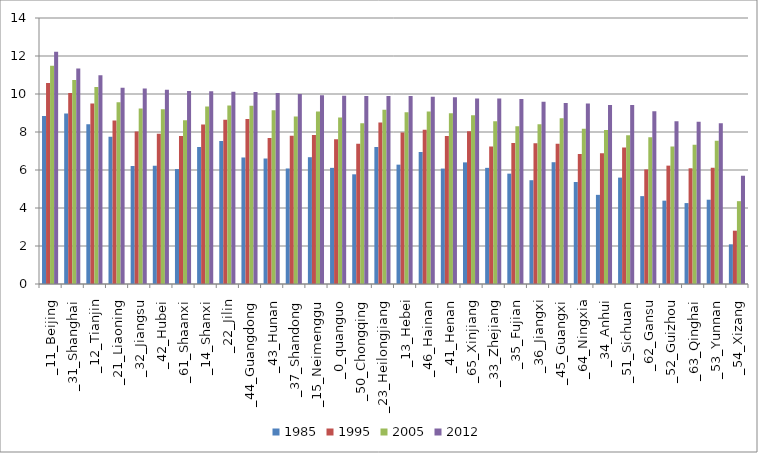
| Category | 1985 | 1995 | 2005 | 2012 |
|---|---|---|---|---|
| _11_Beijing | 8.841 | 10.581 | 11.493 | 12.227 |
| _31_Shanghai | 8.972 | 10.046 | 10.738 | 11.34 |
| _12_Tianjin | 8.406 | 9.5 | 10.371 | 10.991 |
| _21_Liaoning | 7.744 | 8.602 | 9.561 | 10.326 |
| _32_Jiangsu | 6.21 | 8.027 | 9.239 | 10.286 |
| _42_Hubei | 6.224 | 7.901 | 9.191 | 10.228 |
| _61_Shaanxi | 6.049 | 7.794 | 8.614 | 10.161 |
| _14_Shanxi | 7.213 | 8.389 | 9.337 | 10.143 |
| _22_Jilin | 7.521 | 8.638 | 9.397 | 10.119 |
| _44_Guangdong | 6.659 | 8.69 | 9.383 | 10.108 |
| _43_Hunan | 6.605 | 7.678 | 9.14 | 10.057 |
| _37_Shandong | 6.08 | 7.807 | 8.82 | 9.994 |
| _15_Neimenggu | 6.674 | 7.836 | 9.076 | 9.935 |
| _0_quanguo | 6.113 | 7.62 | 8.757 | 9.909 |
| _50_Chongqing | 5.773 | 7.388 | 8.456 | 9.899 |
| _23_Heilongjiang | 7.214 | 8.494 | 9.167 | 9.894 |
| _13_Hebei | 6.281 | 7.968 | 9.038 | 9.892 |
| _46_Hainan | 6.952 | 8.123 | 9.074 | 9.859 |
| _41_Henan | 6.075 | 7.789 | 8.992 | 9.832 |
| _65_Xinjiang | 6.401 | 8.036 | 8.881 | 9.763 |
| _33_Zhejiang | 6.113 | 7.236 | 8.563 | 9.763 |
| _35_Fujian | 5.808 | 7.417 | 8.298 | 9.735 |
| _36_Jiangxi | 5.463 | 7.41 | 8.408 | 9.596 |
| _45_Guangxi | 6.41 | 7.383 | 8.727 | 9.52 |
| _64_Ningxia | 5.368 | 6.843 | 8.166 | 9.499 |
| _34_Anhui | 4.692 | 6.883 | 8.101 | 9.42 |
| _51_Sichuan | 5.599 | 7.18 | 7.835 | 9.418 |
| _62_Gansu | 4.625 | 6.03 | 7.728 | 9.086 |
| _52_Guizhou | 4.386 | 6.23 | 7.232 | 8.568 |
| _63_Qinghai | 4.259 | 6.09 | 7.333 | 8.543 |
| _53_Yunnan | 4.436 | 6.118 | 7.539 | 8.455 |
| _54_Xizang | 2.09 | 2.806 | 4.36 | 5.698 |